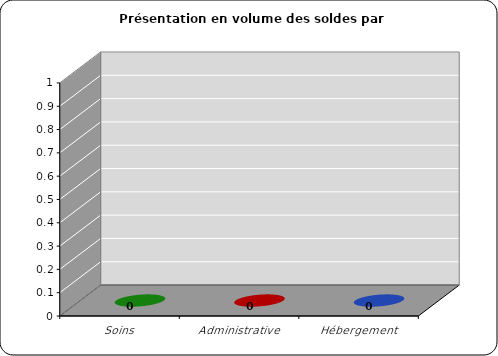
| Category | Solde |
|---|---|
| Soins | 0 |
| Administrative | 0 |
| Hébergement | 0 |